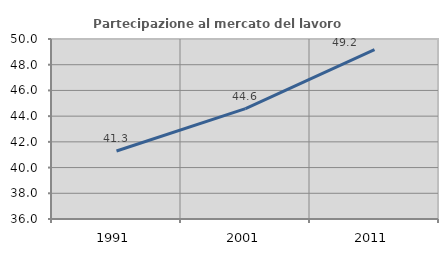
| Category | Partecipazione al mercato del lavoro  femminile |
|---|---|
| 1991.0 | 41.286 |
| 2001.0 | 44.585 |
| 2011.0 | 49.167 |